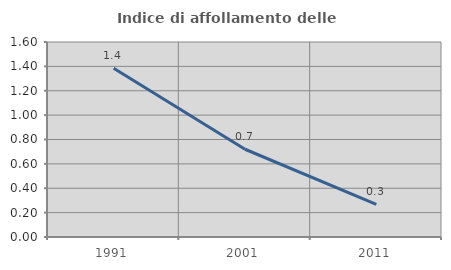
| Category | Indice di affollamento delle abitazioni  |
|---|---|
| 1991.0 | 1.385 |
| 2001.0 | 0.72 |
| 2011.0 | 0.268 |